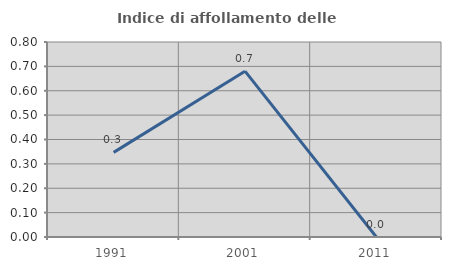
| Category | Indice di affollamento delle abitazioni  |
|---|---|
| 1991.0 | 0.347 |
| 2001.0 | 0.68 |
| 2011.0 | 0 |